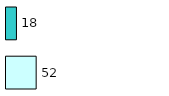
| Category | Series 0 | Series 1 |
|---|---|---|
| 0 | 52 | 18 |